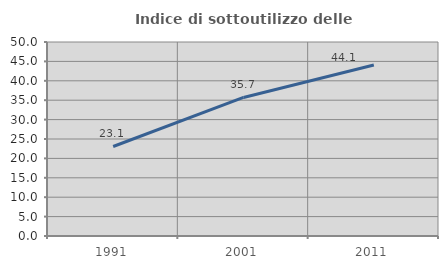
| Category | Indice di sottoutilizzo delle abitazioni  |
|---|---|
| 1991.0 | 23.07 |
| 2001.0 | 35.707 |
| 2011.0 | 44.08 |